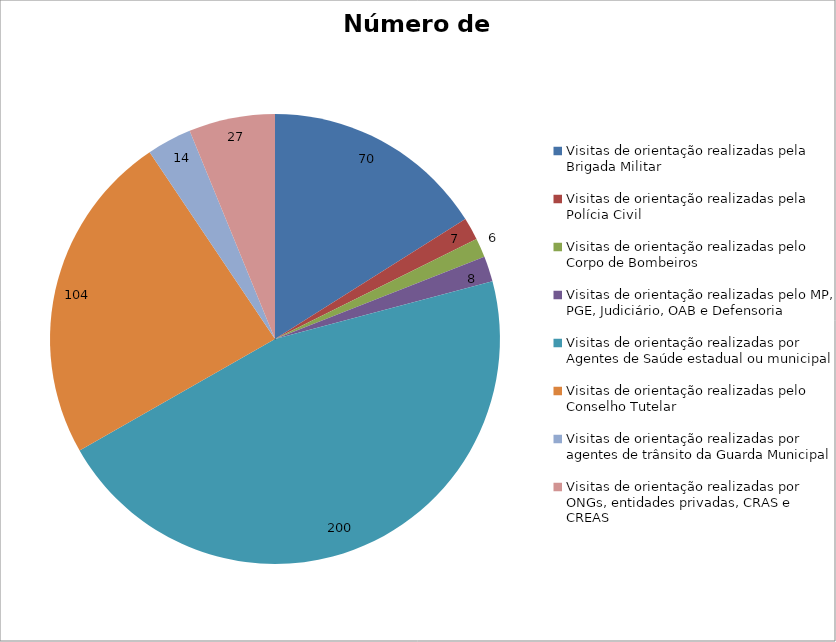
| Category | Número de Ações |
|---|---|
| Visitas de orientação realizadas pela Brigada Militar | 70 |
| Visitas de orientação realizadas pela Polícia Civil | 7 |
| Visitas de orientação realizadas pelo Corpo de Bombeiros | 6 |
| Visitas de orientação realizadas pelo MP, PGE, Judiciário, OAB e Defensoria | 8 |
| Visitas de orientação realizadas por Agentes de Saúde estadual ou municipal | 200 |
| Visitas de orientação realizadas pelo Conselho Tutelar | 104 |
| Visitas de orientação realizadas por agentes de trânsito da Guarda Municipal | 14 |
| Visitas de orientação realizadas por ONGs, entidades privadas, CRAS e CREAS | 27 |